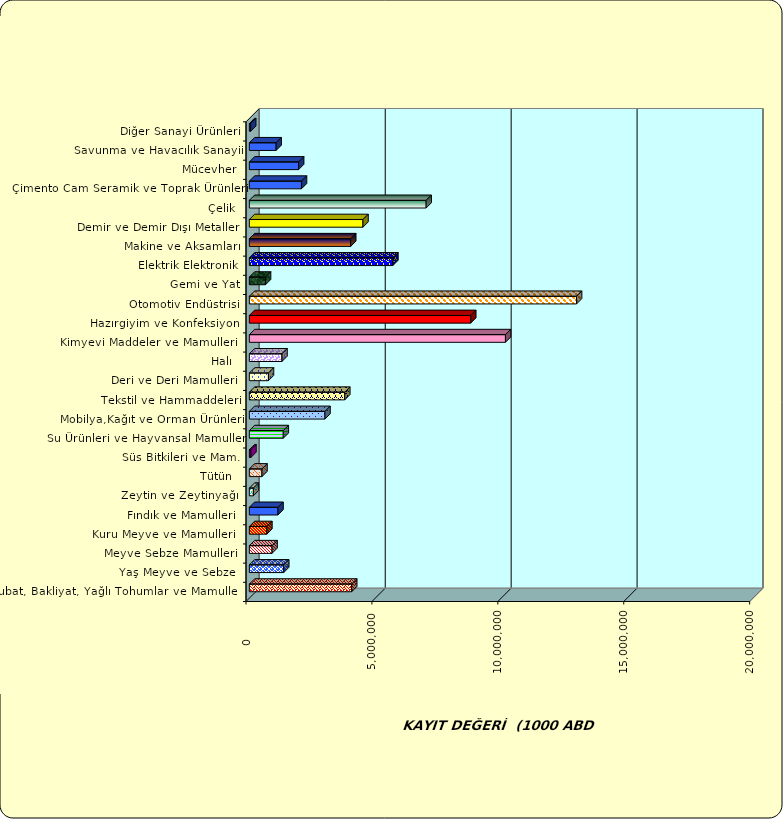
| Category | Series 0 |
|---|---|
|  Hububat, Bakliyat, Yağlı Tohumlar ve Mamulleri  | 4063733.652 |
|  Yaş Meyve ve Sebze   | 1364609.687 |
|  Meyve Sebze Mamulleri  | 901735.576 |
|  Kuru Meyve ve Mamulleri   | 694740.074 |
|  Fındık ve Mamulleri  | 1137929.329 |
|  Zeytin ve Zeytinyağı  | 159943.22 |
|  Tütün  | 500977.922 |
|  Süs Bitkileri ve Mam. | 62105.793 |
|  Su Ürünleri ve Hayvansal Mamuller | 1347680.658 |
|  Mobilya,Kağıt ve Orman Ürünleri | 3002980.55 |
|  Tekstil ve Hammaddeleri | 3788960.09 |
|  Deri ve Deri Mamulleri  | 758505.195 |
|  Halı  | 1295177.007 |
|  Kimyevi Maddeler ve Mamulleri   | 10169983.788 |
|  Hazırgiyim ve Konfeksiyon  | 8790127.794 |
|  Otomotiv Endüstrisi | 12992955.292 |
|  Gemi ve Yat | 641907.936 |
|  Elektrik Elektronik | 5698331.422 |
|  Makine ve Aksamları | 4023991.735 |
|  Demir ve Demir Dışı Metaller  | 4511505.597 |
|  Çelik | 7021033.249 |
|  Çimento Cam Seramik ve Toprak Ürünleri | 2069710.393 |
|  Mücevher | 1955787.848 |
|  Savunma ve Havacılık Sanayii | 1062673.495 |
|  Diğer Sanayi Ürünleri | 52643.493 |